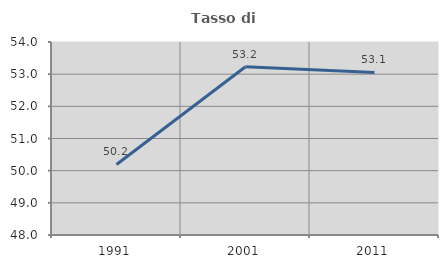
| Category | Tasso di occupazione   |
|---|---|
| 1991.0 | 50.193 |
| 2001.0 | 53.231 |
| 2011.0 | 53.052 |